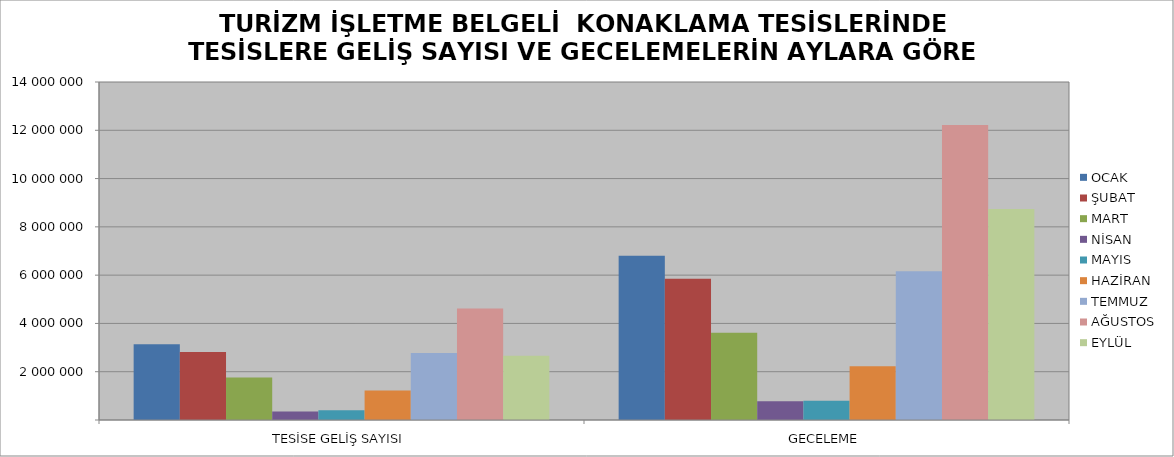
| Category | OCAK | ŞUBAT | MART | NİSAN | MAYIS | HAZİRAN | TEMMUZ | AĞUSTOS | EYLÜL |
|---|---|---|---|---|---|---|---|---|---|
| TESİSE GELİŞ SAYISI | 3140857 | 2816145 | 1756166 | 346964 | 400777 | 1222339 | 2777113 | 4617108 | 2662829 |
| GECELEME | 6806196 | 5853519 | 3616071 | 781724 | 800953 | 2221474 | 6159447 | 12220419 | 8734576 |